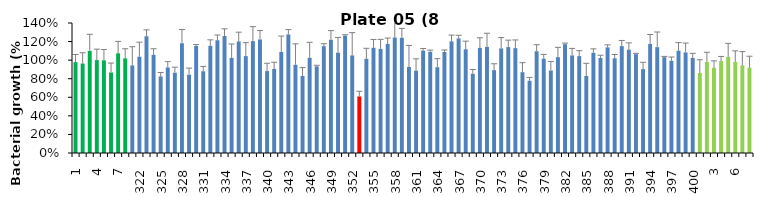
| Category | 8 h % |
|---|---|
| 1.0 | 0.979 |
| 2.0 | 0.964 |
| 3.0 | 1.099 |
| 4.0 | 1.001 |
| 5.0 | 0.998 |
| 6.0 | 0.867 |
| 7.0 | 1.074 |
| 8.0 | 1.019 |
| 321.0 | 0.943 |
| 322.0 | 1.037 |
| 323.0 | 1.257 |
| 324.0 | 1.057 |
| 325.0 | 0.825 |
| 326.0 | 0.922 |
| 327.0 | 0.864 |
| 328.0 | 1.182 |
| 329.0 | 0.843 |
| 330.0 | 1.153 |
| 331.0 | 0.88 |
| 332.0 | 1.154 |
| 333.0 | 1.214 |
| 334.0 | 1.26 |
| 335.0 | 1.025 |
| 336.0 | 1.202 |
| 337.0 | 1.043 |
| 338.0 | 1.205 |
| 339.0 | 1.223 |
| 340.0 | 0.882 |
| 341.0 | 0.906 |
| 342.0 | 1.089 |
| 343.0 | 1.277 |
| 344.0 | 0.95 |
| 345.0 | 0.83 |
| 346.0 | 1.025 |
| 347.0 | 0.933 |
| 348.0 | 1.15 |
| 349.0 | 1.22 |
| 350.0 | 1.08 |
| 351.0 | 1.264 |
| 352.0 | 1.051 |
| 353.0 | 0.609 |
| 354.0 | 1.015 |
| 355.0 | 1.133 |
| 356.0 | 1.121 |
| 357.0 | 1.175 |
| 358.0 | 1.244 |
| 359.0 | 1.241 |
| 360.0 | 0.927 |
| 361.0 | 0.887 |
| 362.0 | 1.103 |
| 363.0 | 1.089 |
| 364.0 | 0.924 |
| 365.0 | 1.088 |
| 366.0 | 1.202 |
| 367.0 | 1.234 |
| 368.0 | 1.117 |
| 369.0 | 0.853 |
| 370.0 | 1.132 |
| 371.0 | 1.143 |
| 372.0 | 0.892 |
| 373.0 | 1.126 |
| 374.0 | 1.141 |
| 375.0 | 1.129 |
| 376.0 | 0.87 |
| 377.0 | 0.778 |
| 378.0 | 1.096 |
| 379.0 | 1.016 |
| 380.0 | 0.888 |
| 381.0 | 1.032 |
| 382.0 | 1.172 |
| 383.0 | 1.051 |
| 384.0 | 1.043 |
| 385.0 | 0.829 |
| 386.0 | 1.079 |
| 387.0 | 1.023 |
| 388.0 | 1.138 |
| 389.0 | 1.02 |
| 390.0 | 1.151 |
| 391.0 | 1.113 |
| 392.0 | 1.065 |
| 393.0 | 0.903 |
| 394.0 | 1.174 |
| 395.0 | 1.14 |
| 396.0 | 1.032 |
| 397.0 | 0.994 |
| 398.0 | 1.101 |
| 399.0 | 1.083 |
| 400.0 | 1.024 |
| 1.0 | 0.861 |
| 2.0 | 0.981 |
| 3.0 | 0.918 |
| 4.0 | 0.99 |
| 5.0 | 1.036 |
| 6.0 | 0.98 |
| 7.0 | 0.944 |
| 8.0 | 0.919 |